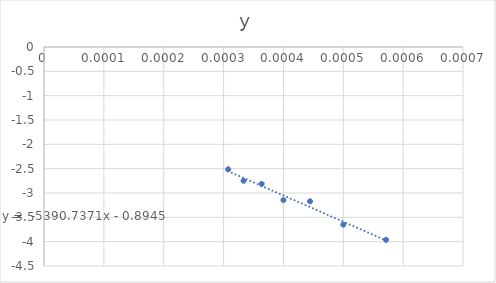
| Category | y |
|---|---|
| 0.000571428571428571 | -3.963 |
| 0.0005 | -3.65 |
| 0.000444444444444444 | -3.17 |
| 0.0004 | -3.147 |
| 0.000363636363636364 | -2.813 |
| 0.000333333333333333 | -2.749 |
| 0.000307692307692308 | -2.513 |